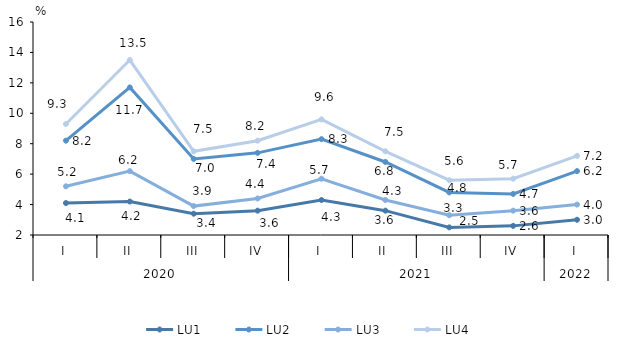
| Category | LU1 | LU2 | LU3 | LU4 |
|---|---|---|---|---|
| 0 | 4.1 | 8.2 | 5.2 | 9.3 |
| 1 | 4.2 | 11.7 | 6.2 | 13.5 |
| 2 | 3.4 | 7 | 3.9 | 7.5 |
| 3 | 3.6 | 7.4 | 4.4 | 8.2 |
| 4 | 4.3 | 8.3 | 5.7 | 9.6 |
| 5 | 3.6 | 6.8 | 4.3 | 7.5 |
| 6 | 2.5 | 4.8 | 3.3 | 5.6 |
| 7 | 2.6 | 4.7 | 3.6 | 5.7 |
| 8 | 3 | 6.2 | 4 | 7.2 |